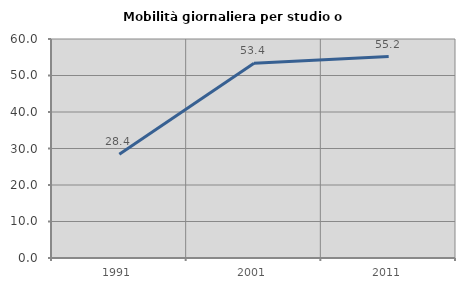
| Category | Mobilità giornaliera per studio o lavoro |
|---|---|
| 1991.0 | 28.402 |
| 2001.0 | 53.383 |
| 2011.0 | 55.172 |